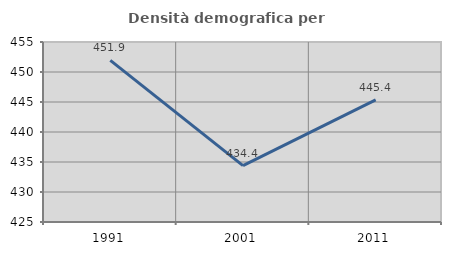
| Category | Densità demografica |
|---|---|
| 1991.0 | 451.946 |
| 2001.0 | 434.395 |
| 2011.0 | 445.353 |